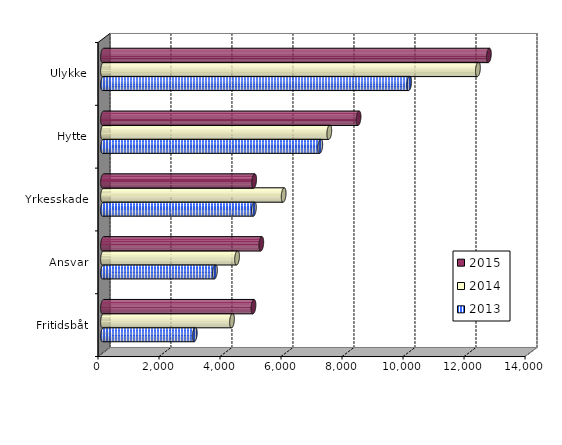
| Category | 2013 | 2014 | 2015 |
|---|---|---|---|
| Fritidsbåt | 3009 | 4229 | 4932.395 |
| Ansvar | 3670 | 4395 | 5188.462 |
| Yrkesskade | 4946 | 5922 | 4955 |
| Hytte | 7122 | 7418 | 8377.47 |
| Ulykke | 10038 | 12291 | 12649.523 |